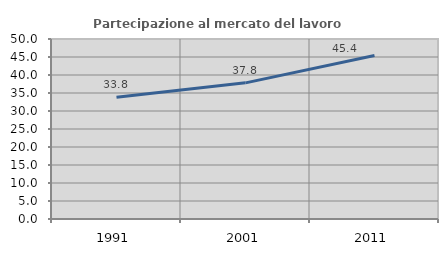
| Category | Partecipazione al mercato del lavoro  femminile |
|---|---|
| 1991.0 | 33.846 |
| 2001.0 | 37.817 |
| 2011.0 | 45.433 |